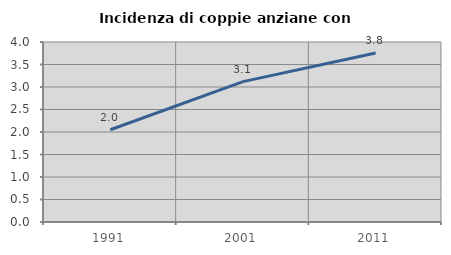
| Category | Incidenza di coppie anziane con figli |
|---|---|
| 1991.0 | 2.05 |
| 2001.0 | 3.12 |
| 2011.0 | 3.757 |